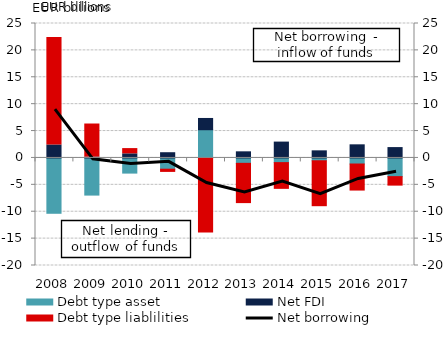
| Category | Debt type asset | Net FDI | Debt type liablilities |
|---|---|---|---|
| 2008.0 | -10.29 | 2.411 | 19.98 |
| 2009.0 | -6.907 | 0.153 | 6.158 |
| 2010.0 | -2.818 | 0.762 | 0.977 |
| 2011.0 | -2.093 | 0.972 | -0.595 |
| 2012.0 | 5.246 | 2.095 | -13.959 |
| 2013.0 | -1.003 | 1.138 | -7.489 |
| 2014.0 | -0.87 | 2.948 | -4.971 |
| 2015.0 | -0.528 | 1.321 | -8.537 |
| 2016.0 | -1.129 | 2.439 | -5.029 |
| 2017.0 | -3.476 | 1.926 | -1.763 |